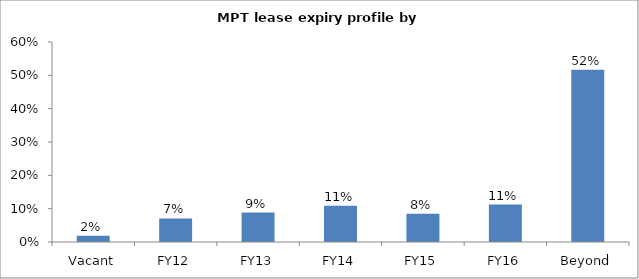
| Category | Series 0 |
|---|---|
| Vacant | 0.019 |
| FY12 | 0.071 |
| FY13 | 0.088 |
| FY14 | 0.109 |
| FY15 | 0.085 |
| FY16 | 0.112 |
| Beyond | 0.516 |